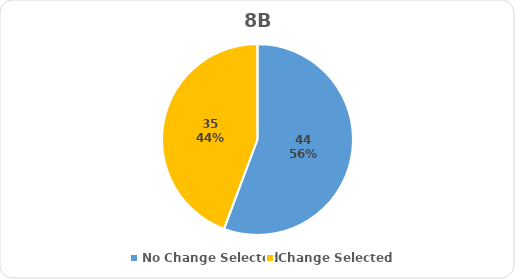
| Category | Series 0 |
|---|---|
| No Change Selected | 44 |
| Change Selected | 35 |